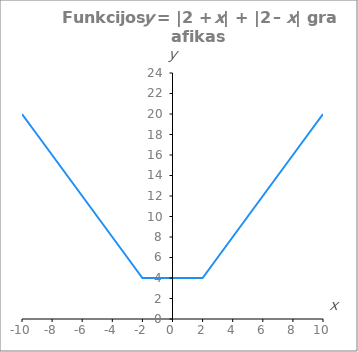
| Category | Series 0 |
|---|---|
| -10.0 | 20 |
| -9.0 | 18 |
| -8.0 | 16 |
| -7.0 | 14 |
| -6.0 | 12 |
| -5.0 | 10 |
| -4.0 | 8 |
| -3.0 | 6 |
| -2.0 | 4 |
| -1.0 | 4 |
| 0.0 | 4 |
| 1.0 | 4 |
| 2.0 | 4 |
| 3.0 | 6 |
| 4.0 | 8 |
| 5.0 | 10 |
| 6.0 | 12 |
| 7.0 | 14 |
| 8.0 | 16 |
| 9.0 | 18 |
| 10.0 | 20 |